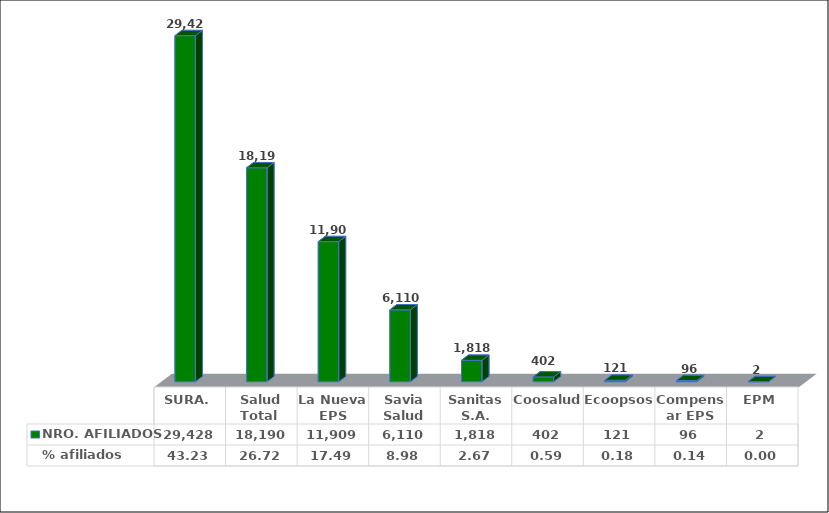
| Category | NRO. AFILIADOS | % afiliados |
|---|---|---|
| SURA. | 29428 | 43.228 |
| Salud Total  | 18190 | 26.72 |
| La Nueva EPS | 11909 | 17.494 |
| Savia Salud | 6110 | 8.975 |
| Sanitas S.A. | 1818 | 2.671 |
| Coosalud | 402 | 0.591 |
| Ecoopsos | 121 | 0.178 |
| Compensar EPS | 96 | 0.141 |
| EPM | 2 | 0.003 |